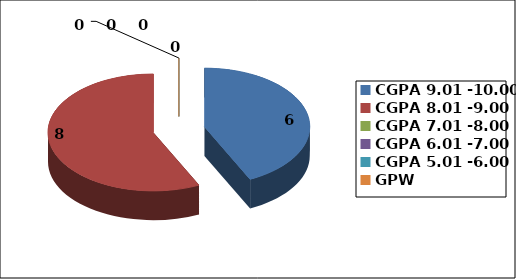
| Category | Series 0 |
|---|---|
| CGPA 9.01 -10.00 | 6 |
| CGPA 8.01 -9.00 | 8 |
| CGPA 7.01 -8.00 | 0 |
| CGPA 6.01 -7.00 | 0 |
| CGPA 5.01 -6.00 | 0 |
| GPW | 0 |